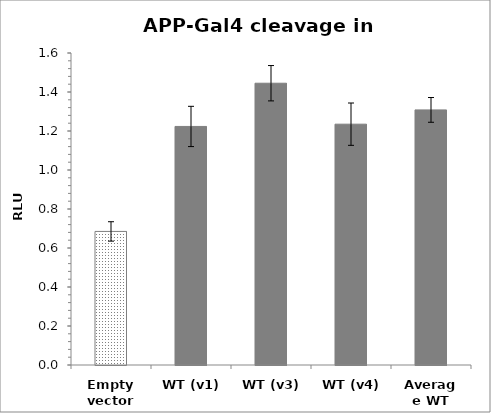
| Category | Series 0 |
|---|---|
| Empty vector | 0.685 |
| WT (v1) | 1.223 |
| WT (v3) | 1.445 |
| WT (v4) | 1.235 |
| Average WT | 1.308 |